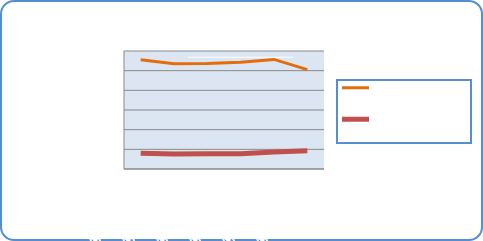
| Category | Motorin Türleri | Benzin Türleri |
|---|---|---|
| 4/15/19 | 55515663.359 | 7972930.512 |
| 4/16/19 | 53474798.069 | 7613557.417 |
| 4/17/19 | 53581234.316 | 7695917.579 |
| 4/18/19 | 54297997.31 | 7724439.907 |
| 4/19/19 | 55710590.337 | 8628405.245 |
| 4/20/19 | 50550042.09 | 9294448.728 |